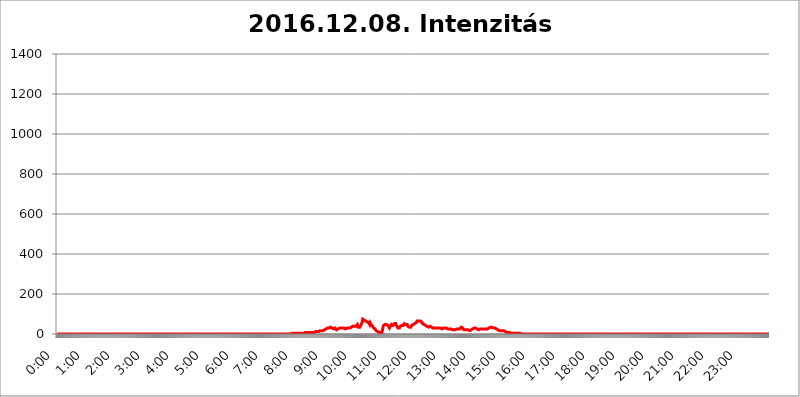
| Category | 2016.12.08. Intenzitás [W/m^2] |
|---|---|
| 0.0 | 0 |
| 0.0006944444444444445 | 0 |
| 0.001388888888888889 | 0 |
| 0.0020833333333333333 | 0 |
| 0.002777777777777778 | 0 |
| 0.003472222222222222 | 0 |
| 0.004166666666666667 | 0 |
| 0.004861111111111111 | 0 |
| 0.005555555555555556 | 0 |
| 0.0062499999999999995 | 0 |
| 0.006944444444444444 | 0 |
| 0.007638888888888889 | 0 |
| 0.008333333333333333 | 0 |
| 0.009027777777777779 | 0 |
| 0.009722222222222222 | 0 |
| 0.010416666666666666 | 0 |
| 0.011111111111111112 | 0 |
| 0.011805555555555555 | 0 |
| 0.012499999999999999 | 0 |
| 0.013194444444444444 | 0 |
| 0.013888888888888888 | 0 |
| 0.014583333333333332 | 0 |
| 0.015277777777777777 | 0 |
| 0.015972222222222224 | 0 |
| 0.016666666666666666 | 0 |
| 0.017361111111111112 | 0 |
| 0.018055555555555557 | 0 |
| 0.01875 | 0 |
| 0.019444444444444445 | 0 |
| 0.02013888888888889 | 0 |
| 0.020833333333333332 | 0 |
| 0.02152777777777778 | 0 |
| 0.022222222222222223 | 0 |
| 0.02291666666666667 | 0 |
| 0.02361111111111111 | 0 |
| 0.024305555555555556 | 0 |
| 0.024999999999999998 | 0 |
| 0.025694444444444447 | 0 |
| 0.02638888888888889 | 0 |
| 0.027083333333333334 | 0 |
| 0.027777777777777776 | 0 |
| 0.02847222222222222 | 0 |
| 0.029166666666666664 | 0 |
| 0.029861111111111113 | 0 |
| 0.030555555555555555 | 0 |
| 0.03125 | 0 |
| 0.03194444444444445 | 0 |
| 0.03263888888888889 | 0 |
| 0.03333333333333333 | 0 |
| 0.034027777777777775 | 0 |
| 0.034722222222222224 | 0 |
| 0.035416666666666666 | 0 |
| 0.036111111111111115 | 0 |
| 0.03680555555555556 | 0 |
| 0.0375 | 0 |
| 0.03819444444444444 | 0 |
| 0.03888888888888889 | 0 |
| 0.03958333333333333 | 0 |
| 0.04027777777777778 | 0 |
| 0.04097222222222222 | 0 |
| 0.041666666666666664 | 0 |
| 0.042361111111111106 | 0 |
| 0.04305555555555556 | 0 |
| 0.043750000000000004 | 0 |
| 0.044444444444444446 | 0 |
| 0.04513888888888889 | 0 |
| 0.04583333333333334 | 0 |
| 0.04652777777777778 | 0 |
| 0.04722222222222222 | 0 |
| 0.04791666666666666 | 0 |
| 0.04861111111111111 | 0 |
| 0.049305555555555554 | 0 |
| 0.049999999999999996 | 0 |
| 0.05069444444444445 | 0 |
| 0.051388888888888894 | 0 |
| 0.052083333333333336 | 0 |
| 0.05277777777777778 | 0 |
| 0.05347222222222222 | 0 |
| 0.05416666666666667 | 0 |
| 0.05486111111111111 | 0 |
| 0.05555555555555555 | 0 |
| 0.05625 | 0 |
| 0.05694444444444444 | 0 |
| 0.057638888888888885 | 0 |
| 0.05833333333333333 | 0 |
| 0.05902777777777778 | 0 |
| 0.059722222222222225 | 0 |
| 0.06041666666666667 | 0 |
| 0.061111111111111116 | 0 |
| 0.06180555555555556 | 0 |
| 0.0625 | 0 |
| 0.06319444444444444 | 0 |
| 0.06388888888888888 | 0 |
| 0.06458333333333334 | 0 |
| 0.06527777777777778 | 0 |
| 0.06597222222222222 | 0 |
| 0.06666666666666667 | 0 |
| 0.06736111111111111 | 0 |
| 0.06805555555555555 | 0 |
| 0.06874999999999999 | 0 |
| 0.06944444444444443 | 0 |
| 0.07013888888888889 | 0 |
| 0.07083333333333333 | 0 |
| 0.07152777777777779 | 0 |
| 0.07222222222222223 | 0 |
| 0.07291666666666667 | 0 |
| 0.07361111111111111 | 0 |
| 0.07430555555555556 | 0 |
| 0.075 | 0 |
| 0.07569444444444444 | 0 |
| 0.0763888888888889 | 0 |
| 0.07708333333333334 | 0 |
| 0.07777777777777778 | 0 |
| 0.07847222222222222 | 0 |
| 0.07916666666666666 | 0 |
| 0.0798611111111111 | 0 |
| 0.08055555555555556 | 0 |
| 0.08125 | 0 |
| 0.08194444444444444 | 0 |
| 0.08263888888888889 | 0 |
| 0.08333333333333333 | 0 |
| 0.08402777777777777 | 0 |
| 0.08472222222222221 | 0 |
| 0.08541666666666665 | 0 |
| 0.08611111111111112 | 0 |
| 0.08680555555555557 | 0 |
| 0.08750000000000001 | 0 |
| 0.08819444444444445 | 0 |
| 0.08888888888888889 | 0 |
| 0.08958333333333333 | 0 |
| 0.09027777777777778 | 0 |
| 0.09097222222222222 | 0 |
| 0.09166666666666667 | 0 |
| 0.09236111111111112 | 0 |
| 0.09305555555555556 | 0 |
| 0.09375 | 0 |
| 0.09444444444444444 | 0 |
| 0.09513888888888888 | 0 |
| 0.09583333333333333 | 0 |
| 0.09652777777777777 | 0 |
| 0.09722222222222222 | 0 |
| 0.09791666666666667 | 0 |
| 0.09861111111111111 | 0 |
| 0.09930555555555555 | 0 |
| 0.09999999999999999 | 0 |
| 0.10069444444444443 | 0 |
| 0.1013888888888889 | 0 |
| 0.10208333333333335 | 0 |
| 0.10277777777777779 | 0 |
| 0.10347222222222223 | 0 |
| 0.10416666666666667 | 0 |
| 0.10486111111111111 | 0 |
| 0.10555555555555556 | 0 |
| 0.10625 | 0 |
| 0.10694444444444444 | 0 |
| 0.1076388888888889 | 0 |
| 0.10833333333333334 | 0 |
| 0.10902777777777778 | 0 |
| 0.10972222222222222 | 0 |
| 0.1111111111111111 | 0 |
| 0.11180555555555556 | 0 |
| 0.11180555555555556 | 0 |
| 0.1125 | 0 |
| 0.11319444444444444 | 0 |
| 0.11388888888888889 | 0 |
| 0.11458333333333333 | 0 |
| 0.11527777777777777 | 0 |
| 0.11597222222222221 | 0 |
| 0.11666666666666665 | 0 |
| 0.1173611111111111 | 0 |
| 0.11805555555555557 | 0 |
| 0.11944444444444445 | 0 |
| 0.12013888888888889 | 0 |
| 0.12083333333333333 | 0 |
| 0.12152777777777778 | 0 |
| 0.12222222222222223 | 0 |
| 0.12291666666666667 | 0 |
| 0.12291666666666667 | 0 |
| 0.12361111111111112 | 0 |
| 0.12430555555555556 | 0 |
| 0.125 | 0 |
| 0.12569444444444444 | 0 |
| 0.12638888888888888 | 0 |
| 0.12708333333333333 | 0 |
| 0.16875 | 0 |
| 0.12847222222222224 | 0 |
| 0.12916666666666668 | 0 |
| 0.12986111111111112 | 0 |
| 0.13055555555555556 | 0 |
| 0.13125 | 0 |
| 0.13194444444444445 | 0 |
| 0.1326388888888889 | 0 |
| 0.13333333333333333 | 0 |
| 0.13402777777777777 | 0 |
| 0.13402777777777777 | 0 |
| 0.13472222222222222 | 0 |
| 0.13541666666666666 | 0 |
| 0.1361111111111111 | 0 |
| 0.13749999999999998 | 0 |
| 0.13819444444444443 | 0 |
| 0.1388888888888889 | 0 |
| 0.13958333333333334 | 0 |
| 0.14027777777777778 | 0 |
| 0.14097222222222222 | 0 |
| 0.14166666666666666 | 0 |
| 0.1423611111111111 | 0 |
| 0.14305555555555557 | 0 |
| 0.14375000000000002 | 0 |
| 0.14444444444444446 | 0 |
| 0.1451388888888889 | 0 |
| 0.1451388888888889 | 0 |
| 0.14652777777777778 | 0 |
| 0.14722222222222223 | 0 |
| 0.14791666666666667 | 0 |
| 0.1486111111111111 | 0 |
| 0.14930555555555555 | 0 |
| 0.15 | 0 |
| 0.15069444444444444 | 0 |
| 0.15138888888888888 | 0 |
| 0.15208333333333332 | 0 |
| 0.15277777777777776 | 0 |
| 0.15347222222222223 | 0 |
| 0.15416666666666667 | 0 |
| 0.15486111111111112 | 0 |
| 0.15555555555555556 | 0 |
| 0.15625 | 0 |
| 0.15694444444444444 | 0 |
| 0.15763888888888888 | 0 |
| 0.15833333333333333 | 0 |
| 0.15902777777777777 | 0 |
| 0.15972222222222224 | 0 |
| 0.16041666666666668 | 0 |
| 0.16111111111111112 | 0 |
| 0.16180555555555556 | 0 |
| 0.1625 | 0 |
| 0.16319444444444445 | 0 |
| 0.1638888888888889 | 0 |
| 0.16458333333333333 | 0 |
| 0.16527777777777777 | 0 |
| 0.16597222222222222 | 0 |
| 0.16666666666666666 | 0 |
| 0.1673611111111111 | 0 |
| 0.16805555555555554 | 0 |
| 0.16874999999999998 | 0 |
| 0.16944444444444443 | 0 |
| 0.17013888888888887 | 0 |
| 0.1708333333333333 | 0 |
| 0.17152777777777775 | 0 |
| 0.17222222222222225 | 0 |
| 0.1729166666666667 | 0 |
| 0.17361111111111113 | 0 |
| 0.17430555555555557 | 0 |
| 0.17500000000000002 | 0 |
| 0.17569444444444446 | 0 |
| 0.1763888888888889 | 0 |
| 0.17708333333333334 | 0 |
| 0.17777777777777778 | 0 |
| 0.17847222222222223 | 0 |
| 0.17916666666666667 | 0 |
| 0.1798611111111111 | 0 |
| 0.18055555555555555 | 0 |
| 0.18125 | 0 |
| 0.18194444444444444 | 0 |
| 0.1826388888888889 | 0 |
| 0.18333333333333335 | 0 |
| 0.1840277777777778 | 0 |
| 0.18472222222222223 | 0 |
| 0.18541666666666667 | 0 |
| 0.18611111111111112 | 0 |
| 0.18680555555555556 | 0 |
| 0.1875 | 0 |
| 0.18819444444444444 | 0 |
| 0.18888888888888888 | 0 |
| 0.18958333333333333 | 0 |
| 0.19027777777777777 | 0 |
| 0.1909722222222222 | 0 |
| 0.19166666666666665 | 0 |
| 0.19236111111111112 | 0 |
| 0.19305555555555554 | 0 |
| 0.19375 | 0 |
| 0.19444444444444445 | 0 |
| 0.1951388888888889 | 0 |
| 0.19583333333333333 | 0 |
| 0.19652777777777777 | 0 |
| 0.19722222222222222 | 0 |
| 0.19791666666666666 | 0 |
| 0.1986111111111111 | 0 |
| 0.19930555555555554 | 0 |
| 0.19999999999999998 | 0 |
| 0.20069444444444443 | 0 |
| 0.20138888888888887 | 0 |
| 0.2020833333333333 | 0 |
| 0.2027777777777778 | 0 |
| 0.2034722222222222 | 0 |
| 0.2041666666666667 | 0 |
| 0.20486111111111113 | 0 |
| 0.20555555555555557 | 0 |
| 0.20625000000000002 | 0 |
| 0.20694444444444446 | 0 |
| 0.2076388888888889 | 0 |
| 0.20833333333333334 | 0 |
| 0.20902777777777778 | 0 |
| 0.20972222222222223 | 0 |
| 0.21041666666666667 | 0 |
| 0.2111111111111111 | 0 |
| 0.21180555555555555 | 0 |
| 0.2125 | 0 |
| 0.21319444444444444 | 0 |
| 0.2138888888888889 | 0 |
| 0.21458333333333335 | 0 |
| 0.2152777777777778 | 0 |
| 0.21597222222222223 | 0 |
| 0.21666666666666667 | 0 |
| 0.21736111111111112 | 0 |
| 0.21805555555555556 | 0 |
| 0.21875 | 0 |
| 0.21944444444444444 | 0 |
| 0.22013888888888888 | 0 |
| 0.22083333333333333 | 0 |
| 0.22152777777777777 | 0 |
| 0.2222222222222222 | 0 |
| 0.22291666666666665 | 0 |
| 0.2236111111111111 | 0 |
| 0.22430555555555556 | 0 |
| 0.225 | 0 |
| 0.22569444444444445 | 0 |
| 0.2263888888888889 | 0 |
| 0.22708333333333333 | 0 |
| 0.22777777777777777 | 0 |
| 0.22847222222222222 | 0 |
| 0.22916666666666666 | 0 |
| 0.2298611111111111 | 0 |
| 0.23055555555555554 | 0 |
| 0.23124999999999998 | 0 |
| 0.23194444444444443 | 0 |
| 0.23263888888888887 | 0 |
| 0.2333333333333333 | 0 |
| 0.2340277777777778 | 0 |
| 0.2347222222222222 | 0 |
| 0.2354166666666667 | 0 |
| 0.23611111111111113 | 0 |
| 0.23680555555555557 | 0 |
| 0.23750000000000002 | 0 |
| 0.23819444444444446 | 0 |
| 0.2388888888888889 | 0 |
| 0.23958333333333334 | 0 |
| 0.24027777777777778 | 0 |
| 0.24097222222222223 | 0 |
| 0.24166666666666667 | 0 |
| 0.2423611111111111 | 0 |
| 0.24305555555555555 | 0 |
| 0.24375 | 0 |
| 0.24444444444444446 | 0 |
| 0.24513888888888888 | 0 |
| 0.24583333333333335 | 0 |
| 0.2465277777777778 | 0 |
| 0.24722222222222223 | 0 |
| 0.24791666666666667 | 0 |
| 0.24861111111111112 | 0 |
| 0.24930555555555556 | 0 |
| 0.25 | 0 |
| 0.25069444444444444 | 0 |
| 0.2513888888888889 | 0 |
| 0.2520833333333333 | 0 |
| 0.25277777777777777 | 0 |
| 0.2534722222222222 | 0 |
| 0.25416666666666665 | 0 |
| 0.2548611111111111 | 0 |
| 0.2555555555555556 | 0 |
| 0.25625000000000003 | 0 |
| 0.2569444444444445 | 0 |
| 0.2576388888888889 | 0 |
| 0.25833333333333336 | 0 |
| 0.2590277777777778 | 0 |
| 0.25972222222222224 | 0 |
| 0.2604166666666667 | 0 |
| 0.2611111111111111 | 0 |
| 0.26180555555555557 | 0 |
| 0.2625 | 0 |
| 0.26319444444444445 | 0 |
| 0.2638888888888889 | 0 |
| 0.26458333333333334 | 0 |
| 0.2652777777777778 | 0 |
| 0.2659722222222222 | 0 |
| 0.26666666666666666 | 0 |
| 0.2673611111111111 | 0 |
| 0.26805555555555555 | 0 |
| 0.26875 | 0 |
| 0.26944444444444443 | 0 |
| 0.2701388888888889 | 0 |
| 0.2708333333333333 | 0 |
| 0.27152777777777776 | 0 |
| 0.2722222222222222 | 0 |
| 0.27291666666666664 | 0 |
| 0.2736111111111111 | 0 |
| 0.2743055555555555 | 0 |
| 0.27499999999999997 | 0 |
| 0.27569444444444446 | 0 |
| 0.27638888888888885 | 0 |
| 0.27708333333333335 | 0 |
| 0.2777777777777778 | 0 |
| 0.27847222222222223 | 0 |
| 0.2791666666666667 | 0 |
| 0.2798611111111111 | 0 |
| 0.28055555555555556 | 0 |
| 0.28125 | 0 |
| 0.28194444444444444 | 0 |
| 0.2826388888888889 | 0 |
| 0.2833333333333333 | 0 |
| 0.28402777777777777 | 0 |
| 0.2847222222222222 | 0 |
| 0.28541666666666665 | 0 |
| 0.28611111111111115 | 0 |
| 0.28680555555555554 | 0 |
| 0.28750000000000003 | 0 |
| 0.2881944444444445 | 0 |
| 0.2888888888888889 | 0 |
| 0.28958333333333336 | 0 |
| 0.2902777777777778 | 0 |
| 0.29097222222222224 | 0 |
| 0.2916666666666667 | 0 |
| 0.2923611111111111 | 0 |
| 0.29305555555555557 | 0 |
| 0.29375 | 0 |
| 0.29444444444444445 | 0 |
| 0.2951388888888889 | 0 |
| 0.29583333333333334 | 0 |
| 0.2965277777777778 | 0 |
| 0.2972222222222222 | 0 |
| 0.29791666666666666 | 0 |
| 0.2986111111111111 | 0 |
| 0.29930555555555555 | 0 |
| 0.3 | 0 |
| 0.30069444444444443 | 0 |
| 0.3013888888888889 | 0 |
| 0.3020833333333333 | 0 |
| 0.30277777777777776 | 0 |
| 0.3034722222222222 | 0 |
| 0.30416666666666664 | 0 |
| 0.3048611111111111 | 0 |
| 0.3055555555555555 | 0 |
| 0.30624999999999997 | 0 |
| 0.3069444444444444 | 0 |
| 0.3076388888888889 | 0 |
| 0.30833333333333335 | 0 |
| 0.3090277777777778 | 0 |
| 0.30972222222222223 | 0 |
| 0.3104166666666667 | 0 |
| 0.3111111111111111 | 0 |
| 0.31180555555555556 | 0 |
| 0.3125 | 0 |
| 0.31319444444444444 | 0 |
| 0.3138888888888889 | 0 |
| 0.3145833333333333 | 0 |
| 0.31527777777777777 | 0 |
| 0.3159722222222222 | 0 |
| 0.31666666666666665 | 0 |
| 0.31736111111111115 | 0 |
| 0.31805555555555554 | 0 |
| 0.31875000000000003 | 0 |
| 0.3194444444444445 | 0 |
| 0.3201388888888889 | 0 |
| 0.32083333333333336 | 0 |
| 0.3215277777777778 | 0 |
| 0.32222222222222224 | 0 |
| 0.3229166666666667 | 0 |
| 0.3236111111111111 | 0 |
| 0.32430555555555557 | 0 |
| 0.325 | 0 |
| 0.32569444444444445 | 3.525 |
| 0.3263888888888889 | 0 |
| 0.32708333333333334 | 0 |
| 0.3277777777777778 | 0 |
| 0.3284722222222222 | 3.525 |
| 0.32916666666666666 | 3.525 |
| 0.3298611111111111 | 3.525 |
| 0.33055555555555555 | 3.525 |
| 0.33125 | 3.525 |
| 0.33194444444444443 | 3.525 |
| 0.3326388888888889 | 3.525 |
| 0.3333333333333333 | 3.525 |
| 0.3340277777777778 | 3.525 |
| 0.3347222222222222 | 3.525 |
| 0.3354166666666667 | 3.525 |
| 0.3361111111111111 | 3.525 |
| 0.3368055555555556 | 3.525 |
| 0.33749999999999997 | 3.525 |
| 0.33819444444444446 | 3.525 |
| 0.33888888888888885 | 3.525 |
| 0.33958333333333335 | 3.525 |
| 0.34027777777777773 | 3.525 |
| 0.34097222222222223 | 3.525 |
| 0.3416666666666666 | 3.525 |
| 0.3423611111111111 | 3.525 |
| 0.3430555555555555 | 3.525 |
| 0.34375 | 3.525 |
| 0.3444444444444445 | 3.525 |
| 0.3451388888888889 | 3.525 |
| 0.3458333333333334 | 3.525 |
| 0.34652777777777777 | 3.525 |
| 0.34722222222222227 | 3.525 |
| 0.34791666666666665 | 7.887 |
| 0.34861111111111115 | 3.525 |
| 0.34930555555555554 | 7.887 |
| 0.35000000000000003 | 7.887 |
| 0.3506944444444444 | 7.887 |
| 0.3513888888888889 | 7.887 |
| 0.3520833333333333 | 7.887 |
| 0.3527777777777778 | 7.887 |
| 0.3534722222222222 | 7.887 |
| 0.3541666666666667 | 7.887 |
| 0.3548611111111111 | 7.887 |
| 0.35555555555555557 | 7.887 |
| 0.35625 | 7.887 |
| 0.35694444444444445 | 7.887 |
| 0.3576388888888889 | 7.887 |
| 0.35833333333333334 | 7.887 |
| 0.3590277777777778 | 7.887 |
| 0.3597222222222222 | 7.887 |
| 0.36041666666666666 | 7.887 |
| 0.3611111111111111 | 7.887 |
| 0.36180555555555555 | 7.887 |
| 0.3625 | 12.257 |
| 0.36319444444444443 | 12.257 |
| 0.3638888888888889 | 12.257 |
| 0.3645833333333333 | 12.257 |
| 0.3652777777777778 | 12.257 |
| 0.3659722222222222 | 12.257 |
| 0.3666666666666667 | 12.257 |
| 0.3673611111111111 | 12.257 |
| 0.3680555555555556 | 12.257 |
| 0.36874999999999997 | 16.636 |
| 0.36944444444444446 | 16.636 |
| 0.37013888888888885 | 16.636 |
| 0.37083333333333335 | 16.636 |
| 0.37152777777777773 | 16.636 |
| 0.37222222222222223 | 16.636 |
| 0.3729166666666666 | 16.636 |
| 0.3736111111111111 | 21.024 |
| 0.3743055555555555 | 21.024 |
| 0.375 | 21.024 |
| 0.3756944444444445 | 25.419 |
| 0.3763888888888889 | 25.419 |
| 0.3770833333333334 | 25.419 |
| 0.37777777777777777 | 29.823 |
| 0.37847222222222227 | 29.823 |
| 0.37916666666666665 | 29.823 |
| 0.37986111111111115 | 29.823 |
| 0.38055555555555554 | 29.823 |
| 0.38125000000000003 | 29.823 |
| 0.3819444444444444 | 29.823 |
| 0.3826388888888889 | 29.823 |
| 0.3833333333333333 | 34.234 |
| 0.3840277777777778 | 29.823 |
| 0.3847222222222222 | 29.823 |
| 0.3854166666666667 | 29.823 |
| 0.3861111111111111 | 29.823 |
| 0.38680555555555557 | 29.823 |
| 0.3875 | 25.419 |
| 0.38819444444444445 | 25.419 |
| 0.3888888888888889 | 25.419 |
| 0.38958333333333334 | 29.823 |
| 0.3902777777777778 | 25.419 |
| 0.3909722222222222 | 25.419 |
| 0.39166666666666666 | 21.024 |
| 0.3923611111111111 | 25.419 |
| 0.39305555555555555 | 25.419 |
| 0.39375 | 25.419 |
| 0.39444444444444443 | 29.823 |
| 0.3951388888888889 | 29.823 |
| 0.3958333333333333 | 29.823 |
| 0.3965277777777778 | 34.234 |
| 0.3972222222222222 | 29.823 |
| 0.3979166666666667 | 29.823 |
| 0.3986111111111111 | 25.419 |
| 0.3993055555555556 | 29.823 |
| 0.39999999999999997 | 29.823 |
| 0.40069444444444446 | 29.823 |
| 0.40138888888888885 | 29.823 |
| 0.40208333333333335 | 29.823 |
| 0.40277777777777773 | 25.419 |
| 0.40347222222222223 | 25.419 |
| 0.4041666666666666 | 25.419 |
| 0.4048611111111111 | 25.419 |
| 0.4055555555555555 | 29.823 |
| 0.40625 | 29.823 |
| 0.4069444444444445 | 29.823 |
| 0.4076388888888889 | 29.823 |
| 0.4083333333333334 | 29.823 |
| 0.40902777777777777 | 29.823 |
| 0.40972222222222227 | 29.823 |
| 0.41041666666666665 | 29.823 |
| 0.41111111111111115 | 29.823 |
| 0.41180555555555554 | 29.823 |
| 0.41250000000000003 | 34.234 |
| 0.4131944444444444 | 34.234 |
| 0.4138888888888889 | 34.234 |
| 0.4145833333333333 | 38.653 |
| 0.4152777777777778 | 38.653 |
| 0.4159722222222222 | 38.653 |
| 0.4166666666666667 | 38.653 |
| 0.4173611111111111 | 38.653 |
| 0.41805555555555557 | 38.653 |
| 0.41875 | 38.653 |
| 0.41944444444444445 | 38.653 |
| 0.4201388888888889 | 43.079 |
| 0.42083333333333334 | 47.511 |
| 0.4215277777777778 | 43.079 |
| 0.4222222222222222 | 34.234 |
| 0.42291666666666666 | 29.823 |
| 0.4236111111111111 | 29.823 |
| 0.42430555555555555 | 34.234 |
| 0.425 | 34.234 |
| 0.42569444444444443 | 38.653 |
| 0.4263888888888889 | 47.511 |
| 0.4270833333333333 | 47.511 |
| 0.4277777777777778 | 60.85 |
| 0.4284722222222222 | 74.246 |
| 0.4291666666666667 | 69.775 |
| 0.4298611111111111 | 69.775 |
| 0.4305555555555556 | 69.775 |
| 0.43124999999999997 | 69.775 |
| 0.43194444444444446 | 65.31 |
| 0.43263888888888885 | 65.31 |
| 0.43333333333333335 | 65.31 |
| 0.43402777777777773 | 60.85 |
| 0.43472222222222223 | 60.85 |
| 0.4354166666666666 | 60.85 |
| 0.4361111111111111 | 56.398 |
| 0.4368055555555555 | 56.398 |
| 0.4375 | 51.951 |
| 0.4381944444444445 | 47.511 |
| 0.4388888888888889 | 56.398 |
| 0.4395833333333334 | 51.951 |
| 0.44027777777777777 | 47.511 |
| 0.44097222222222227 | 47.511 |
| 0.44166666666666665 | 43.079 |
| 0.44236111111111115 | 38.653 |
| 0.44305555555555554 | 34.234 |
| 0.44375000000000003 | 29.823 |
| 0.4444444444444444 | 29.823 |
| 0.4451388888888889 | 29.823 |
| 0.4458333333333333 | 25.419 |
| 0.4465277777777778 | 21.024 |
| 0.4472222222222222 | 16.636 |
| 0.4479166666666667 | 16.636 |
| 0.4486111111111111 | 12.257 |
| 0.44930555555555557 | 12.257 |
| 0.45 | 12.257 |
| 0.45069444444444445 | 7.887 |
| 0.4513888888888889 | 7.887 |
| 0.45208333333333334 | 7.887 |
| 0.4527777777777778 | 7.887 |
| 0.4534722222222222 | 7.887 |
| 0.45416666666666666 | 7.887 |
| 0.4548611111111111 | 7.887 |
| 0.45555555555555555 | 7.887 |
| 0.45625 | 21.024 |
| 0.45694444444444443 | 34.234 |
| 0.4576388888888889 | 43.079 |
| 0.4583333333333333 | 43.079 |
| 0.4590277777777778 | 43.079 |
| 0.4597222222222222 | 47.511 |
| 0.4604166666666667 | 43.079 |
| 0.4611111111111111 | 47.511 |
| 0.4618055555555556 | 47.511 |
| 0.46249999999999997 | 43.079 |
| 0.46319444444444446 | 43.079 |
| 0.46388888888888885 | 43.079 |
| 0.46458333333333335 | 43.079 |
| 0.46527777777777773 | 38.653 |
| 0.46597222222222223 | 29.823 |
| 0.4666666666666666 | 29.823 |
| 0.4673611111111111 | 38.653 |
| 0.4680555555555555 | 43.079 |
| 0.46875 | 47.511 |
| 0.4694444444444445 | 43.079 |
| 0.4701388888888889 | 43.079 |
| 0.4708333333333334 | 43.079 |
| 0.47152777777777777 | 47.511 |
| 0.47222222222222227 | 47.511 |
| 0.47291666666666665 | 51.951 |
| 0.47361111111111115 | 51.951 |
| 0.47430555555555554 | 51.951 |
| 0.47500000000000003 | 51.951 |
| 0.4756944444444444 | 43.079 |
| 0.4763888888888889 | 38.653 |
| 0.4770833333333333 | 38.653 |
| 0.4777777777777778 | 29.823 |
| 0.4784722222222222 | 29.823 |
| 0.4791666666666667 | 29.823 |
| 0.4798611111111111 | 29.823 |
| 0.48055555555555557 | 34.234 |
| 0.48125 | 38.653 |
| 0.48194444444444445 | 43.079 |
| 0.4826388888888889 | 43.079 |
| 0.48333333333333334 | 43.079 |
| 0.4840277777777778 | 38.653 |
| 0.4847222222222222 | 38.653 |
| 0.48541666666666666 | 43.079 |
| 0.4861111111111111 | 47.511 |
| 0.48680555555555555 | 51.951 |
| 0.4875 | 51.951 |
| 0.48819444444444443 | 47.511 |
| 0.4888888888888889 | 47.511 |
| 0.4895833333333333 | 47.511 |
| 0.4902777777777778 | 47.511 |
| 0.4909722222222222 | 47.511 |
| 0.4916666666666667 | 38.653 |
| 0.4923611111111111 | 38.653 |
| 0.4930555555555556 | 34.234 |
| 0.49374999999999997 | 34.234 |
| 0.49444444444444446 | 34.234 |
| 0.49513888888888885 | 34.234 |
| 0.49583333333333335 | 34.234 |
| 0.49652777777777773 | 38.653 |
| 0.49722222222222223 | 43.079 |
| 0.4979166666666666 | 43.079 |
| 0.4986111111111111 | 43.079 |
| 0.4993055555555555 | 47.511 |
| 0.5 | 51.951 |
| 0.5006944444444444 | 51.951 |
| 0.5013888888888889 | 51.951 |
| 0.5020833333333333 | 56.398 |
| 0.5027777777777778 | 56.398 |
| 0.5034722222222222 | 56.398 |
| 0.5041666666666667 | 60.85 |
| 0.5048611111111111 | 65.31 |
| 0.5055555555555555 | 65.31 |
| 0.50625 | 65.31 |
| 0.5069444444444444 | 65.31 |
| 0.5076388888888889 | 65.31 |
| 0.5083333333333333 | 65.31 |
| 0.5090277777777777 | 65.31 |
| 0.5097222222222222 | 65.31 |
| 0.5104166666666666 | 65.31 |
| 0.5111111111111112 | 60.85 |
| 0.5118055555555555 | 56.398 |
| 0.5125000000000001 | 51.951 |
| 0.5131944444444444 | 51.951 |
| 0.513888888888889 | 47.511 |
| 0.5145833333333333 | 47.511 |
| 0.5152777777777778 | 47.511 |
| 0.5159722222222222 | 47.511 |
| 0.5166666666666667 | 43.079 |
| 0.517361111111111 | 38.653 |
| 0.5180555555555556 | 38.653 |
| 0.5187499999999999 | 38.653 |
| 0.5194444444444445 | 38.653 |
| 0.5201388888888888 | 38.653 |
| 0.5208333333333334 | 34.234 |
| 0.5215277777777778 | 34.234 |
| 0.5222222222222223 | 34.234 |
| 0.5229166666666667 | 38.653 |
| 0.5236111111111111 | 38.653 |
| 0.5243055555555556 | 38.653 |
| 0.525 | 34.234 |
| 0.5256944444444445 | 34.234 |
| 0.5263888888888889 | 29.823 |
| 0.5270833333333333 | 29.823 |
| 0.5277777777777778 | 25.419 |
| 0.5284722222222222 | 29.823 |
| 0.5291666666666667 | 29.823 |
| 0.5298611111111111 | 29.823 |
| 0.5305555555555556 | 29.823 |
| 0.53125 | 29.823 |
| 0.5319444444444444 | 29.823 |
| 0.5326388888888889 | 29.823 |
| 0.5333333333333333 | 29.823 |
| 0.5340277777777778 | 34.234 |
| 0.5347222222222222 | 34.234 |
| 0.5354166666666667 | 29.823 |
| 0.5361111111111111 | 34.234 |
| 0.5368055555555555 | 29.823 |
| 0.5375 | 29.823 |
| 0.5381944444444444 | 29.823 |
| 0.5388888888888889 | 29.823 |
| 0.5395833333333333 | 25.419 |
| 0.5402777777777777 | 29.823 |
| 0.5409722222222222 | 25.419 |
| 0.5416666666666666 | 29.823 |
| 0.5423611111111112 | 29.823 |
| 0.5430555555555555 | 29.823 |
| 0.5437500000000001 | 29.823 |
| 0.5444444444444444 | 29.823 |
| 0.545138888888889 | 29.823 |
| 0.5458333333333333 | 29.823 |
| 0.5465277777777778 | 29.823 |
| 0.5472222222222222 | 29.823 |
| 0.5479166666666667 | 25.419 |
| 0.548611111111111 | 25.419 |
| 0.5493055555555556 | 25.419 |
| 0.5499999999999999 | 25.419 |
| 0.5506944444444445 | 25.419 |
| 0.5513888888888888 | 25.419 |
| 0.5520833333333334 | 25.419 |
| 0.5527777777777778 | 21.024 |
| 0.5534722222222223 | 21.024 |
| 0.5541666666666667 | 21.024 |
| 0.5548611111111111 | 21.024 |
| 0.5555555555555556 | 21.024 |
| 0.55625 | 21.024 |
| 0.5569444444444445 | 21.024 |
| 0.5576388888888889 | 21.024 |
| 0.5583333333333333 | 21.024 |
| 0.5590277777777778 | 21.024 |
| 0.5597222222222222 | 21.024 |
| 0.5604166666666667 | 25.419 |
| 0.5611111111111111 | 29.823 |
| 0.5618055555555556 | 25.419 |
| 0.5625 | 25.419 |
| 0.5631944444444444 | 25.419 |
| 0.5638888888888889 | 25.419 |
| 0.5645833333333333 | 25.419 |
| 0.5652777777777778 | 25.419 |
| 0.5659722222222222 | 29.823 |
| 0.5666666666666667 | 34.234 |
| 0.5673611111111111 | 29.823 |
| 0.5680555555555555 | 29.823 |
| 0.56875 | 29.823 |
| 0.5694444444444444 | 25.419 |
| 0.5701388888888889 | 21.024 |
| 0.5708333333333333 | 21.024 |
| 0.5715277777777777 | 21.024 |
| 0.5722222222222222 | 21.024 |
| 0.5729166666666666 | 21.024 |
| 0.5736111111111112 | 21.024 |
| 0.5743055555555555 | 21.024 |
| 0.5750000000000001 | 21.024 |
| 0.5756944444444444 | 21.024 |
| 0.576388888888889 | 21.024 |
| 0.5770833333333333 | 21.024 |
| 0.5777777777777778 | 21.024 |
| 0.5784722222222222 | 16.636 |
| 0.5791666666666667 | 16.636 |
| 0.579861111111111 | 16.636 |
| 0.5805555555555556 | 21.024 |
| 0.5812499999999999 | 21.024 |
| 0.5819444444444445 | 25.419 |
| 0.5826388888888888 | 25.419 |
| 0.5833333333333334 | 29.823 |
| 0.5840277777777778 | 29.823 |
| 0.5847222222222223 | 29.823 |
| 0.5854166666666667 | 29.823 |
| 0.5861111111111111 | 29.823 |
| 0.5868055555555556 | 29.823 |
| 0.5875 | 29.823 |
| 0.5881944444444445 | 29.823 |
| 0.5888888888888889 | 25.419 |
| 0.5895833333333333 | 25.419 |
| 0.5902777777777778 | 21.024 |
| 0.5909722222222222 | 21.024 |
| 0.5916666666666667 | 25.419 |
| 0.5923611111111111 | 25.419 |
| 0.5930555555555556 | 25.419 |
| 0.59375 | 25.419 |
| 0.5944444444444444 | 25.419 |
| 0.5951388888888889 | 25.419 |
| 0.5958333333333333 | 25.419 |
| 0.5965277777777778 | 25.419 |
| 0.5972222222222222 | 25.419 |
| 0.5979166666666667 | 25.419 |
| 0.5986111111111111 | 25.419 |
| 0.5993055555555555 | 25.419 |
| 0.6 | 25.419 |
| 0.6006944444444444 | 25.419 |
| 0.6013888888888889 | 25.419 |
| 0.6020833333333333 | 25.419 |
| 0.6027777777777777 | 25.419 |
| 0.6034722222222222 | 25.419 |
| 0.6041666666666666 | 25.419 |
| 0.6048611111111112 | 29.823 |
| 0.6055555555555555 | 29.823 |
| 0.6062500000000001 | 29.823 |
| 0.6069444444444444 | 29.823 |
| 0.607638888888889 | 34.234 |
| 0.6083333333333333 | 34.234 |
| 0.6090277777777778 | 34.234 |
| 0.6097222222222222 | 34.234 |
| 0.6104166666666667 | 34.234 |
| 0.611111111111111 | 34.234 |
| 0.6118055555555556 | 29.823 |
| 0.6124999999999999 | 29.823 |
| 0.6131944444444445 | 29.823 |
| 0.6138888888888888 | 29.823 |
| 0.6145833333333334 | 25.419 |
| 0.6152777777777778 | 25.419 |
| 0.6159722222222223 | 25.419 |
| 0.6166666666666667 | 25.419 |
| 0.6173611111111111 | 21.024 |
| 0.6180555555555556 | 21.024 |
| 0.61875 | 21.024 |
| 0.6194444444444445 | 16.636 |
| 0.6201388888888889 | 16.636 |
| 0.6208333333333333 | 16.636 |
| 0.6215277777777778 | 16.636 |
| 0.6222222222222222 | 16.636 |
| 0.6229166666666667 | 16.636 |
| 0.6236111111111111 | 16.636 |
| 0.6243055555555556 | 16.636 |
| 0.625 | 16.636 |
| 0.6256944444444444 | 16.636 |
| 0.6263888888888889 | 16.636 |
| 0.6270833333333333 | 12.257 |
| 0.6277777777777778 | 12.257 |
| 0.6284722222222222 | 12.257 |
| 0.6291666666666667 | 12.257 |
| 0.6298611111111111 | 12.257 |
| 0.6305555555555555 | 7.887 |
| 0.63125 | 7.887 |
| 0.6319444444444444 | 7.887 |
| 0.6326388888888889 | 7.887 |
| 0.6333333333333333 | 7.887 |
| 0.6340277777777777 | 7.887 |
| 0.6347222222222222 | 7.887 |
| 0.6354166666666666 | 7.887 |
| 0.6361111111111112 | 3.525 |
| 0.6368055555555555 | 3.525 |
| 0.6375000000000001 | 3.525 |
| 0.6381944444444444 | 3.525 |
| 0.638888888888889 | 3.525 |
| 0.6395833333333333 | 3.525 |
| 0.6402777777777778 | 3.525 |
| 0.6409722222222222 | 3.525 |
| 0.6416666666666667 | 3.525 |
| 0.642361111111111 | 3.525 |
| 0.6430555555555556 | 3.525 |
| 0.6437499999999999 | 3.525 |
| 0.6444444444444445 | 3.525 |
| 0.6451388888888888 | 3.525 |
| 0.6458333333333334 | 3.525 |
| 0.6465277777777778 | 3.525 |
| 0.6472222222222223 | 3.525 |
| 0.6479166666666667 | 3.525 |
| 0.6486111111111111 | 3.525 |
| 0.6493055555555556 | 3.525 |
| 0.65 | 3.525 |
| 0.6506944444444445 | 0 |
| 0.6513888888888889 | 0 |
| 0.6520833333333333 | 0 |
| 0.6527777777777778 | 0 |
| 0.6534722222222222 | 0 |
| 0.6541666666666667 | 0 |
| 0.6548611111111111 | 0 |
| 0.6555555555555556 | 0 |
| 0.65625 | 0 |
| 0.6569444444444444 | 0 |
| 0.6576388888888889 | 0 |
| 0.6583333333333333 | 0 |
| 0.6590277777777778 | 0 |
| 0.6597222222222222 | 0 |
| 0.6604166666666667 | 0 |
| 0.6611111111111111 | 0 |
| 0.6618055555555555 | 0 |
| 0.6625 | 0 |
| 0.6631944444444444 | 0 |
| 0.6638888888888889 | 0 |
| 0.6645833333333333 | 0 |
| 0.6652777777777777 | 0 |
| 0.6659722222222222 | 0 |
| 0.6666666666666666 | 0 |
| 0.6673611111111111 | 0 |
| 0.6680555555555556 | 0 |
| 0.6687500000000001 | 0 |
| 0.6694444444444444 | 0 |
| 0.6701388888888888 | 0 |
| 0.6708333333333334 | 0 |
| 0.6715277777777778 | 0 |
| 0.6722222222222222 | 0 |
| 0.6729166666666666 | 0 |
| 0.6736111111111112 | 0 |
| 0.6743055555555556 | 0 |
| 0.6749999999999999 | 0 |
| 0.6756944444444444 | 0 |
| 0.6763888888888889 | 0 |
| 0.6770833333333334 | 0 |
| 0.6777777777777777 | 0 |
| 0.6784722222222223 | 0 |
| 0.6791666666666667 | 0 |
| 0.6798611111111111 | 0 |
| 0.6805555555555555 | 0 |
| 0.68125 | 0 |
| 0.6819444444444445 | 0 |
| 0.6826388888888889 | 0 |
| 0.6833333333333332 | 0 |
| 0.6840277777777778 | 0 |
| 0.6847222222222222 | 0 |
| 0.6854166666666667 | 0 |
| 0.686111111111111 | 0 |
| 0.6868055555555556 | 0 |
| 0.6875 | 0 |
| 0.6881944444444444 | 0 |
| 0.688888888888889 | 0 |
| 0.6895833333333333 | 0 |
| 0.6902777777777778 | 0 |
| 0.6909722222222222 | 0 |
| 0.6916666666666668 | 0 |
| 0.6923611111111111 | 0 |
| 0.6930555555555555 | 0 |
| 0.69375 | 0 |
| 0.6944444444444445 | 0 |
| 0.6951388888888889 | 0 |
| 0.6958333333333333 | 0 |
| 0.6965277777777777 | 0 |
| 0.6972222222222223 | 0 |
| 0.6979166666666666 | 0 |
| 0.6986111111111111 | 0 |
| 0.6993055555555556 | 0 |
| 0.7000000000000001 | 0 |
| 0.7006944444444444 | 0 |
| 0.7013888888888888 | 0 |
| 0.7020833333333334 | 0 |
| 0.7027777777777778 | 0 |
| 0.7034722222222222 | 0 |
| 0.7041666666666666 | 0 |
| 0.7048611111111112 | 0 |
| 0.7055555555555556 | 0 |
| 0.7062499999999999 | 0 |
| 0.7069444444444444 | 0 |
| 0.7076388888888889 | 0 |
| 0.7083333333333334 | 0 |
| 0.7090277777777777 | 0 |
| 0.7097222222222223 | 0 |
| 0.7104166666666667 | 0 |
| 0.7111111111111111 | 0 |
| 0.7118055555555555 | 0 |
| 0.7125 | 0 |
| 0.7131944444444445 | 0 |
| 0.7138888888888889 | 0 |
| 0.7145833333333332 | 0 |
| 0.7152777777777778 | 0 |
| 0.7159722222222222 | 0 |
| 0.7166666666666667 | 0 |
| 0.717361111111111 | 0 |
| 0.7180555555555556 | 0 |
| 0.71875 | 0 |
| 0.7194444444444444 | 0 |
| 0.720138888888889 | 0 |
| 0.7208333333333333 | 0 |
| 0.7215277777777778 | 0 |
| 0.7222222222222222 | 0 |
| 0.7229166666666668 | 0 |
| 0.7236111111111111 | 0 |
| 0.7243055555555555 | 0 |
| 0.725 | 0 |
| 0.7256944444444445 | 0 |
| 0.7263888888888889 | 0 |
| 0.7270833333333333 | 0 |
| 0.7277777777777777 | 0 |
| 0.7284722222222223 | 0 |
| 0.7291666666666666 | 0 |
| 0.7298611111111111 | 0 |
| 0.7305555555555556 | 0 |
| 0.7312500000000001 | 0 |
| 0.7319444444444444 | 0 |
| 0.7326388888888888 | 0 |
| 0.7333333333333334 | 0 |
| 0.7340277777777778 | 0 |
| 0.7347222222222222 | 0 |
| 0.7354166666666666 | 0 |
| 0.7361111111111112 | 0 |
| 0.7368055555555556 | 0 |
| 0.7374999999999999 | 0 |
| 0.7381944444444444 | 0 |
| 0.7388888888888889 | 0 |
| 0.7395833333333334 | 0 |
| 0.7402777777777777 | 0 |
| 0.7409722222222223 | 0 |
| 0.7416666666666667 | 0 |
| 0.7423611111111111 | 0 |
| 0.7430555555555555 | 0 |
| 0.74375 | 0 |
| 0.7444444444444445 | 0 |
| 0.7451388888888889 | 0 |
| 0.7458333333333332 | 0 |
| 0.7465277777777778 | 0 |
| 0.7472222222222222 | 0 |
| 0.7479166666666667 | 0 |
| 0.748611111111111 | 0 |
| 0.7493055555555556 | 0 |
| 0.75 | 0 |
| 0.7506944444444444 | 0 |
| 0.751388888888889 | 0 |
| 0.7520833333333333 | 0 |
| 0.7527777777777778 | 0 |
| 0.7534722222222222 | 0 |
| 0.7541666666666668 | 0 |
| 0.7548611111111111 | 0 |
| 0.7555555555555555 | 0 |
| 0.75625 | 0 |
| 0.7569444444444445 | 0 |
| 0.7576388888888889 | 0 |
| 0.7583333333333333 | 0 |
| 0.7590277777777777 | 0 |
| 0.7597222222222223 | 0 |
| 0.7604166666666666 | 0 |
| 0.7611111111111111 | 0 |
| 0.7618055555555556 | 0 |
| 0.7625000000000001 | 0 |
| 0.7631944444444444 | 0 |
| 0.7638888888888888 | 0 |
| 0.7645833333333334 | 0 |
| 0.7652777777777778 | 0 |
| 0.7659722222222222 | 0 |
| 0.7666666666666666 | 0 |
| 0.7673611111111112 | 0 |
| 0.7680555555555556 | 0 |
| 0.7687499999999999 | 0 |
| 0.7694444444444444 | 0 |
| 0.7701388888888889 | 0 |
| 0.7708333333333334 | 0 |
| 0.7715277777777777 | 0 |
| 0.7722222222222223 | 0 |
| 0.7729166666666667 | 0 |
| 0.7736111111111111 | 0 |
| 0.7743055555555555 | 0 |
| 0.775 | 0 |
| 0.7756944444444445 | 0 |
| 0.7763888888888889 | 0 |
| 0.7770833333333332 | 0 |
| 0.7777777777777778 | 0 |
| 0.7784722222222222 | 0 |
| 0.7791666666666667 | 0 |
| 0.779861111111111 | 0 |
| 0.7805555555555556 | 0 |
| 0.78125 | 0 |
| 0.7819444444444444 | 0 |
| 0.782638888888889 | 0 |
| 0.7833333333333333 | 0 |
| 0.7840277777777778 | 0 |
| 0.7847222222222222 | 0 |
| 0.7854166666666668 | 0 |
| 0.7861111111111111 | 0 |
| 0.7868055555555555 | 0 |
| 0.7875 | 0 |
| 0.7881944444444445 | 0 |
| 0.7888888888888889 | 0 |
| 0.7895833333333333 | 0 |
| 0.7902777777777777 | 0 |
| 0.7909722222222223 | 0 |
| 0.7916666666666666 | 0 |
| 0.7923611111111111 | 0 |
| 0.7930555555555556 | 0 |
| 0.7937500000000001 | 0 |
| 0.7944444444444444 | 0 |
| 0.7951388888888888 | 0 |
| 0.7958333333333334 | 0 |
| 0.7965277777777778 | 0 |
| 0.7972222222222222 | 0 |
| 0.7979166666666666 | 0 |
| 0.7986111111111112 | 0 |
| 0.7993055555555556 | 0 |
| 0.7999999999999999 | 0 |
| 0.8006944444444444 | 0 |
| 0.8013888888888889 | 0 |
| 0.8020833333333334 | 0 |
| 0.8027777777777777 | 0 |
| 0.8034722222222223 | 0 |
| 0.8041666666666667 | 0 |
| 0.8048611111111111 | 0 |
| 0.8055555555555555 | 0 |
| 0.80625 | 0 |
| 0.8069444444444445 | 0 |
| 0.8076388888888889 | 0 |
| 0.8083333333333332 | 0 |
| 0.8090277777777778 | 0 |
| 0.8097222222222222 | 0 |
| 0.8104166666666667 | 0 |
| 0.811111111111111 | 0 |
| 0.8118055555555556 | 0 |
| 0.8125 | 0 |
| 0.8131944444444444 | 0 |
| 0.813888888888889 | 0 |
| 0.8145833333333333 | 0 |
| 0.8152777777777778 | 0 |
| 0.8159722222222222 | 0 |
| 0.8166666666666668 | 0 |
| 0.8173611111111111 | 0 |
| 0.8180555555555555 | 0 |
| 0.81875 | 0 |
| 0.8194444444444445 | 0 |
| 0.8201388888888889 | 0 |
| 0.8208333333333333 | 0 |
| 0.8215277777777777 | 0 |
| 0.8222222222222223 | 0 |
| 0.8229166666666666 | 0 |
| 0.8236111111111111 | 0 |
| 0.8243055555555556 | 0 |
| 0.8250000000000001 | 0 |
| 0.8256944444444444 | 0 |
| 0.8263888888888888 | 0 |
| 0.8270833333333334 | 0 |
| 0.8277777777777778 | 0 |
| 0.8284722222222222 | 0 |
| 0.8291666666666666 | 0 |
| 0.8298611111111112 | 0 |
| 0.8305555555555556 | 0 |
| 0.8312499999999999 | 0 |
| 0.8319444444444444 | 0 |
| 0.8326388888888889 | 0 |
| 0.8333333333333334 | 0 |
| 0.8340277777777777 | 0 |
| 0.8347222222222223 | 0 |
| 0.8354166666666667 | 0 |
| 0.8361111111111111 | 0 |
| 0.8368055555555555 | 0 |
| 0.8375 | 0 |
| 0.8381944444444445 | 0 |
| 0.8388888888888889 | 0 |
| 0.8395833333333332 | 0 |
| 0.8402777777777778 | 0 |
| 0.8409722222222222 | 0 |
| 0.8416666666666667 | 0 |
| 0.842361111111111 | 0 |
| 0.8430555555555556 | 0 |
| 0.84375 | 0 |
| 0.8444444444444444 | 0 |
| 0.845138888888889 | 0 |
| 0.8458333333333333 | 0 |
| 0.8465277777777778 | 0 |
| 0.8472222222222222 | 0 |
| 0.8479166666666668 | 0 |
| 0.8486111111111111 | 0 |
| 0.8493055555555555 | 0 |
| 0.85 | 0 |
| 0.8506944444444445 | 0 |
| 0.8513888888888889 | 0 |
| 0.8520833333333333 | 0 |
| 0.8527777777777777 | 0 |
| 0.8534722222222223 | 0 |
| 0.8541666666666666 | 0 |
| 0.8548611111111111 | 0 |
| 0.8555555555555556 | 0 |
| 0.8562500000000001 | 0 |
| 0.8569444444444444 | 0 |
| 0.8576388888888888 | 0 |
| 0.8583333333333334 | 0 |
| 0.8590277777777778 | 0 |
| 0.8597222222222222 | 0 |
| 0.8604166666666666 | 0 |
| 0.8611111111111112 | 0 |
| 0.8618055555555556 | 0 |
| 0.8624999999999999 | 0 |
| 0.8631944444444444 | 0 |
| 0.8638888888888889 | 0 |
| 0.8645833333333334 | 0 |
| 0.8652777777777777 | 0 |
| 0.8659722222222223 | 0 |
| 0.8666666666666667 | 0 |
| 0.8673611111111111 | 0 |
| 0.8680555555555555 | 0 |
| 0.86875 | 0 |
| 0.8694444444444445 | 0 |
| 0.8701388888888889 | 0 |
| 0.8708333333333332 | 0 |
| 0.8715277777777778 | 0 |
| 0.8722222222222222 | 0 |
| 0.8729166666666667 | 0 |
| 0.873611111111111 | 0 |
| 0.8743055555555556 | 0 |
| 0.875 | 0 |
| 0.8756944444444444 | 0 |
| 0.876388888888889 | 0 |
| 0.8770833333333333 | 0 |
| 0.8777777777777778 | 0 |
| 0.8784722222222222 | 0 |
| 0.8791666666666668 | 0 |
| 0.8798611111111111 | 0 |
| 0.8805555555555555 | 0 |
| 0.88125 | 0 |
| 0.8819444444444445 | 0 |
| 0.8826388888888889 | 0 |
| 0.8833333333333333 | 0 |
| 0.8840277777777777 | 0 |
| 0.8847222222222223 | 0 |
| 0.8854166666666666 | 0 |
| 0.8861111111111111 | 0 |
| 0.8868055555555556 | 0 |
| 0.8875000000000001 | 0 |
| 0.8881944444444444 | 0 |
| 0.8888888888888888 | 0 |
| 0.8895833333333334 | 0 |
| 0.8902777777777778 | 0 |
| 0.8909722222222222 | 0 |
| 0.8916666666666666 | 0 |
| 0.8923611111111112 | 0 |
| 0.8930555555555556 | 0 |
| 0.8937499999999999 | 0 |
| 0.8944444444444444 | 0 |
| 0.8951388888888889 | 0 |
| 0.8958333333333334 | 0 |
| 0.8965277777777777 | 0 |
| 0.8972222222222223 | 0 |
| 0.8979166666666667 | 0 |
| 0.8986111111111111 | 0 |
| 0.8993055555555555 | 0 |
| 0.9 | 0 |
| 0.9006944444444445 | 0 |
| 0.9013888888888889 | 0 |
| 0.9020833333333332 | 0 |
| 0.9027777777777778 | 0 |
| 0.9034722222222222 | 0 |
| 0.9041666666666667 | 0 |
| 0.904861111111111 | 0 |
| 0.9055555555555556 | 0 |
| 0.90625 | 0 |
| 0.9069444444444444 | 0 |
| 0.907638888888889 | 0 |
| 0.9083333333333333 | 0 |
| 0.9090277777777778 | 0 |
| 0.9097222222222222 | 0 |
| 0.9104166666666668 | 0 |
| 0.9111111111111111 | 0 |
| 0.9118055555555555 | 0 |
| 0.9125 | 0 |
| 0.9131944444444445 | 0 |
| 0.9138888888888889 | 0 |
| 0.9145833333333333 | 0 |
| 0.9152777777777777 | 0 |
| 0.9159722222222223 | 0 |
| 0.9166666666666666 | 0 |
| 0.9173611111111111 | 0 |
| 0.9180555555555556 | 0 |
| 0.9187500000000001 | 0 |
| 0.9194444444444444 | 0 |
| 0.9201388888888888 | 0 |
| 0.9208333333333334 | 0 |
| 0.9215277777777778 | 0 |
| 0.9222222222222222 | 0 |
| 0.9229166666666666 | 0 |
| 0.9236111111111112 | 0 |
| 0.9243055555555556 | 0 |
| 0.9249999999999999 | 0 |
| 0.9256944444444444 | 0 |
| 0.9263888888888889 | 0 |
| 0.9270833333333334 | 0 |
| 0.9277777777777777 | 0 |
| 0.9284722222222223 | 0 |
| 0.9291666666666667 | 0 |
| 0.9298611111111111 | 0 |
| 0.9305555555555555 | 0 |
| 0.93125 | 0 |
| 0.9319444444444445 | 0 |
| 0.9326388888888889 | 0 |
| 0.9333333333333332 | 0 |
| 0.9340277777777778 | 0 |
| 0.9347222222222222 | 0 |
| 0.9354166666666667 | 0 |
| 0.936111111111111 | 0 |
| 0.9368055555555556 | 0 |
| 0.9375 | 0 |
| 0.9381944444444444 | 0 |
| 0.938888888888889 | 0 |
| 0.9395833333333333 | 0 |
| 0.9402777777777778 | 0 |
| 0.9409722222222222 | 0 |
| 0.9416666666666668 | 0 |
| 0.9423611111111111 | 0 |
| 0.9430555555555555 | 0 |
| 0.94375 | 0 |
| 0.9444444444444445 | 0 |
| 0.9451388888888889 | 0 |
| 0.9458333333333333 | 0 |
| 0.9465277777777777 | 0 |
| 0.9472222222222223 | 0 |
| 0.9479166666666666 | 0 |
| 0.9486111111111111 | 0 |
| 0.9493055555555556 | 0 |
| 0.9500000000000001 | 0 |
| 0.9506944444444444 | 0 |
| 0.9513888888888888 | 0 |
| 0.9520833333333334 | 0 |
| 0.9527777777777778 | 0 |
| 0.9534722222222222 | 0 |
| 0.9541666666666666 | 0 |
| 0.9548611111111112 | 0 |
| 0.9555555555555556 | 0 |
| 0.9562499999999999 | 0 |
| 0.9569444444444444 | 0 |
| 0.9576388888888889 | 0 |
| 0.9583333333333334 | 0 |
| 0.9590277777777777 | 0 |
| 0.9597222222222223 | 0 |
| 0.9604166666666667 | 0 |
| 0.9611111111111111 | 0 |
| 0.9618055555555555 | 0 |
| 0.9625 | 0 |
| 0.9631944444444445 | 0 |
| 0.9638888888888889 | 0 |
| 0.9645833333333332 | 0 |
| 0.9652777777777778 | 0 |
| 0.9659722222222222 | 0 |
| 0.9666666666666667 | 0 |
| 0.967361111111111 | 0 |
| 0.9680555555555556 | 0 |
| 0.96875 | 0 |
| 0.9694444444444444 | 0 |
| 0.970138888888889 | 0 |
| 0.9708333333333333 | 0 |
| 0.9715277777777778 | 0 |
| 0.9722222222222222 | 0 |
| 0.9729166666666668 | 0 |
| 0.9736111111111111 | 0 |
| 0.9743055555555555 | 0 |
| 0.975 | 0 |
| 0.9756944444444445 | 0 |
| 0.9763888888888889 | 0 |
| 0.9770833333333333 | 0 |
| 0.9777777777777777 | 0 |
| 0.9784722222222223 | 0 |
| 0.9791666666666666 | 0 |
| 0.9798611111111111 | 0 |
| 0.9805555555555556 | 0 |
| 0.9812500000000001 | 0 |
| 0.9819444444444444 | 0 |
| 0.9826388888888888 | 0 |
| 0.9833333333333334 | 0 |
| 0.9840277777777778 | 0 |
| 0.9847222222222222 | 0 |
| 0.9854166666666666 | 0 |
| 0.9861111111111112 | 0 |
| 0.9868055555555556 | 0 |
| 0.9874999999999999 | 0 |
| 0.9881944444444444 | 0 |
| 0.9888888888888889 | 0 |
| 0.9895833333333334 | 0 |
| 0.9902777777777777 | 0 |
| 0.9909722222222223 | 0 |
| 0.9916666666666667 | 0 |
| 0.9923611111111111 | 0 |
| 0.9930555555555555 | 0 |
| 0.99375 | 0 |
| 0.9944444444444445 | 0 |
| 0.9951388888888889 | 0 |
| 0.9958333333333332 | 0 |
| 0.9965277777777778 | 0 |
| 0.9972222222222222 | 0 |
| 0.9979166666666667 | 0 |
| 0.998611111111111 | 0 |
| 0.9993055555555556 | 0 |